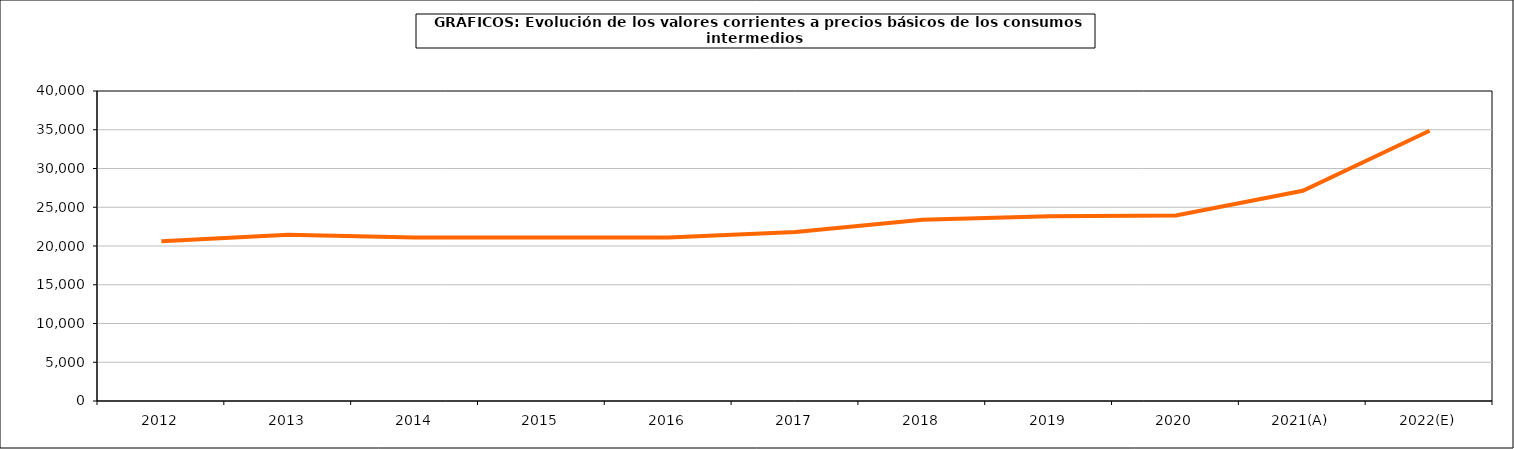
| Category | Total consumos intermedios |
|---|---|
| 2012 | 20625.1 |
| 2013 | 21445.2 |
| 2014 | 21097.4 |
| 2015 | 21104.1 |
| 2016 | 21083.6 |
| 2017 | 21794.5 |
| 2018 | 23401.5 |
| 2019 | 23844.5 |
| 2020 | 23945.8 |
| 2021(A) | 27132.8 |
| 2022(E) | 34872 |